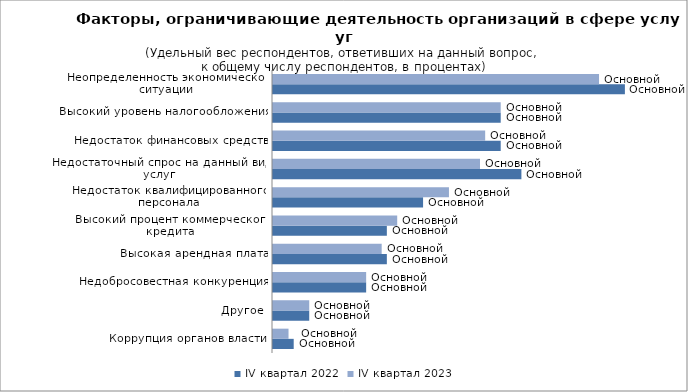
| Category | IV квартал 2022 | IV квартал 2023 |
|---|---|---|
| Коррупция органов власти | 4 | 3 |
| Другое | 7 | 7 |
| Недобросовестная конкуренция | 18 | 18 |
| Высокая арендная плата | 22 | 21 |
| Высокий процент коммерческого кредита | 22 | 24 |
| Недостаток квалифицированного персонала | 29 | 34 |
| Недостаточный спрос на данный вид услуг | 48 | 40 |
| Недостаток финансовых средств | 44 | 41 |
| Высокий уровень налогообложения | 44 | 44 |
| Неопределенность экономической ситуации | 68 | 63 |